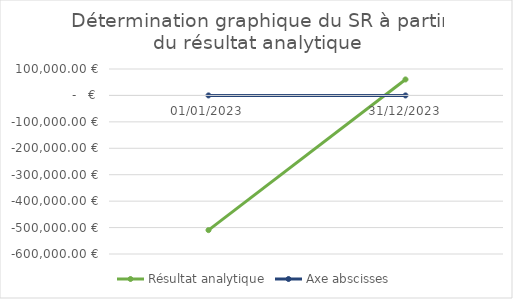
| Category | Résultat analytique | Axe abscisses |
|---|---|---|
| 01/01/2023 | -509627 | 0 |
| 31/12/2023 | 60455 | 0 |